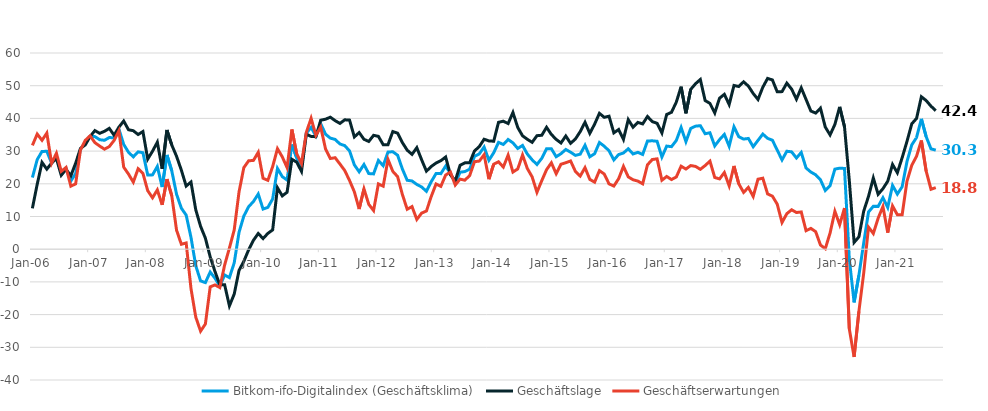
| Category | Bitkom-ifo-Digitalindex (Geschäftsklima) | Geschäftslage | Geschäftserwartungen |
|---|---|---|---|
| 2006-01-01 | 21.91 | 12.49 | 31.75 |
| 2006-02-01 | 27.4 | 19.84 | 35.21 |
| 2006-03-01 | 29.9 | 26.55 | 33.3 |
| 2006-04-01 | 29.93 | 24.48 | 35.52 |
| 2006-05-01 | 26.32 | 26.35 | 26.29 |
| 2006-06-01 | 28.52 | 27.71 | 29.34 |
| 2006-07-01 | 23.21 | 22.61 | 23.81 |
| 2006-08-01 | 24.7 | 24.39 | 25 |
| 2006-09-01 | 20.86 | 22.46 | 19.28 |
| 2006-10-01 | 23.13 | 26.31 | 19.98 |
| 2006-11-01 | 30.57 | 30.81 | 30.34 |
| 2006-12-01 | 32.59 | 31.89 | 33.29 |
| 2007-01-01 | 34.55 | 34.43 | 34.67 |
| 2007-02-01 | 34.43 | 36.28 | 32.6 |
| 2007-03-01 | 33.48 | 35.44 | 31.54 |
| 2007-04-01 | 33.31 | 36.06 | 30.59 |
| 2007-05-01 | 34.15 | 36.95 | 31.38 |
| 2007-06-01 | 34.06 | 34.85 | 33.27 |
| 2007-07-01 | 36.75 | 37.32 | 36.18 |
| 2007-08-01 | 32.04 | 39.2 | 25.1 |
| 2007-09-01 | 29.65 | 36.53 | 22.97 |
| 2007-10-01 | 28.24 | 36.23 | 20.51 |
| 2007-11-01 | 29.78 | 35.07 | 24.61 |
| 2007-12-01 | 29.5 | 35.98 | 23.19 |
| 2008-01-01 | 22.67 | 27.56 | 17.89 |
| 2008-02-01 | 22.73 | 29.98 | 15.72 |
| 2008-03-01 | 25.32 | 32.73 | 18.14 |
| 2008-04-01 | 19 | 24.59 | 13.55 |
| 2008-05-01 | 28.82 | 36.44 | 21.44 |
| 2008-06-01 | 23.99 | 31.88 | 16.36 |
| 2008-07-01 | 16.82 | 28.41 | 5.81 |
| 2008-08-01 | 12.53 | 24.16 | 1.51 |
| 2008-09-01 | 10.43 | 19.31 | 1.91 |
| 2008-10-01 | 3.62 | 20.54 | -12.01 |
| 2008-11-01 | -5.07 | 12.03 | -20.78 |
| 2008-12-01 | -9.7 | 7 | -25.06 |
| 2009-01-01 | -10.21 | 3.37 | -22.87 |
| 2009-02-01 | -6.99 | -2.35 | -11.52 |
| 2009-03-01 | -8.88 | -6.83 | -10.92 |
| 2009-04-01 | -11.31 | -10.88 | -11.73 |
| 2009-05-01 | -7.89 | -10.85 | -4.87 |
| 2009-06-01 | -8.69 | -17.33 | 0.36 |
| 2009-07-01 | -4.16 | -13.72 | 5.9 |
| 2009-08-01 | 5.16 | -6.49 | 17.52 |
| 2009-09-01 | 10.14 | -3.7 | 24.95 |
| 2009-10-01 | 12.99 | -0.18 | 27.03 |
| 2009-11-01 | 14.59 | 2.72 | 27.16 |
| 2009-12-01 | 16.87 | 4.81 | 29.63 |
| 2010-01-01 | 12.27 | 3.25 | 21.69 |
| 2010-02-01 | 12.79 | 4.83 | 21.06 |
| 2010-03-01 | 15.37 | 5.91 | 25.27 |
| 2010-04-01 | 24.69 | 18.79 | 30.74 |
| 2010-05-01 | 22.19 | 16.3 | 28.24 |
| 2010-06-01 | 21.15 | 17.42 | 24.95 |
| 2010-07-01 | 32.01 | 27.49 | 36.61 |
| 2010-08-01 | 27.91 | 26.62 | 29.2 |
| 2010-09-01 | 24.98 | 23.8 | 26.17 |
| 2010-10-01 | 35.43 | 35.18 | 35.69 |
| 2010-11-01 | 37.25 | 34.49 | 40.04 |
| 2010-12-01 | 34.6 | 34.4 | 34.8 |
| 2011-01-01 | 38.39 | 39.45 | 37.34 |
| 2011-02-01 | 35.17 | 39.75 | 30.68 |
| 2011-03-01 | 33.97 | 40.37 | 27.73 |
| 2011-04-01 | 33.57 | 39.31 | 27.98 |
| 2011-05-01 | 32.18 | 38.47 | 26.05 |
| 2011-06-01 | 31.68 | 39.57 | 24.06 |
| 2011-07-01 | 30.05 | 39.48 | 21 |
| 2011-08-01 | 25.79 | 34.34 | 17.55 |
| 2011-09-01 | 23.67 | 35.66 | 12.28 |
| 2011-10-01 | 25.9 | 33.61 | 18.44 |
| 2011-11-01 | 23.13 | 32.95 | 13.72 |
| 2011-12-01 | 23.03 | 34.82 | 11.83 |
| 2012-01-01 | 27.13 | 34.52 | 19.97 |
| 2012-02-01 | 25.53 | 31.97 | 19.27 |
| 2012-03-01 | 29.7 | 31.97 | 27.45 |
| 2012-04-01 | 29.81 | 35.97 | 23.8 |
| 2012-05-01 | 28.74 | 35.48 | 22.19 |
| 2012-06-01 | 24.5 | 32.59 | 16.69 |
| 2012-07-01 | 21.07 | 30.28 | 12.22 |
| 2012-08-01 | 20.87 | 29 | 13.03 |
| 2012-09-01 | 19.8 | 31.05 | 9.1 |
| 2012-10-01 | 19.03 | 27.34 | 11.03 |
| 2012-11-01 | 17.7 | 23.87 | 11.69 |
| 2012-12-01 | 20.65 | 25.29 | 16.11 |
| 2013-01-01 | 23.13 | 26.35 | 19.95 |
| 2013-02-01 | 23.11 | 27.07 | 19.23 |
| 2013-03-01 | 25.42 | 28.19 | 22.68 |
| 2013-04-01 | 23.16 | 22.73 | 23.59 |
| 2013-05-01 | 20.26 | 20.9 | 19.62 |
| 2013-06-01 | 23.54 | 25.66 | 21.43 |
| 2013-07-01 | 23.74 | 26.41 | 21.1 |
| 2013-08-01 | 24.48 | 26.45 | 22.53 |
| 2013-09-01 | 28.4 | 30.05 | 26.76 |
| 2013-10-01 | 29.15 | 31.38 | 26.95 |
| 2013-11-01 | 31.25 | 33.63 | 28.9 |
| 2013-12-01 | 27.19 | 33.12 | 21.41 |
| 2014-01-01 | 29.49 | 33.02 | 26.01 |
| 2014-02-01 | 32.68 | 38.8 | 26.73 |
| 2014-03-01 | 32.03 | 39.15 | 25.12 |
| 2014-04-01 | 33.55 | 38.42 | 28.77 |
| 2014-05-01 | 32.52 | 41.81 | 23.59 |
| 2014-06-01 | 30.8 | 37.24 | 24.54 |
| 2014-07-01 | 31.73 | 34.68 | 28.82 |
| 2014-08-01 | 29.09 | 33.6 | 24.67 |
| 2014-09-01 | 27.33 | 32.68 | 22.11 |
| 2014-10-01 | 25.9 | 34.72 | 17.4 |
| 2014-11-01 | 27.79 | 34.84 | 20.96 |
| 2014-12-01 | 30.71 | 37.28 | 24.32 |
| 2015-01-01 | 30.71 | 35.09 | 26.42 |
| 2015-02-01 | 28.28 | 33.59 | 23.09 |
| 2015-03-01 | 29.21 | 32.49 | 25.98 |
| 2015-04-01 | 30.5 | 34.62 | 26.45 |
| 2015-05-01 | 29.66 | 32.38 | 26.98 |
| 2015-06-01 | 28.69 | 33.7 | 23.79 |
| 2015-07-01 | 29.06 | 35.95 | 22.36 |
| 2015-08-01 | 31.78 | 38.82 | 24.94 |
| 2015-09-01 | 28.27 | 35.42 | 21.34 |
| 2015-10-01 | 29.2 | 38.25 | 20.5 |
| 2015-11-01 | 32.62 | 41.55 | 24.03 |
| 2015-12-01 | 31.5 | 40.33 | 22.99 |
| 2016-01-01 | 30.09 | 40.67 | 19.98 |
| 2016-02-01 | 27.3 | 35.58 | 19.31 |
| 2016-03-01 | 28.95 | 36.6 | 21.55 |
| 2016-04-01 | 29.42 | 33.58 | 25.33 |
| 2016-05-01 | 30.71 | 39.63 | 22.12 |
| 2016-06-01 | 29.12 | 37.29 | 21.23 |
| 2016-07-01 | 29.63 | 38.78 | 20.83 |
| 2016-08-01 | 28.97 | 38.31 | 20 |
| 2016-09-01 | 33.08 | 40.58 | 25.81 |
| 2016-10-01 | 33.15 | 39.02 | 27.42 |
| 2016-11-01 | 33 | 38.5 | 27.63 |
| 2016-12-01 | 28.2 | 35.53 | 21.09 |
| 2017-01-01 | 31.53 | 41.2 | 22.24 |
| 2017-02-01 | 31.36 | 41.87 | 21.3 |
| 2017-03-01 | 33.25 | 44.98 | 22.09 |
| 2017-04-01 | 37.22 | 49.7 | 25.38 |
| 2017-05-01 | 32.89 | 41.56 | 24.52 |
| 2017-06-01 | 36.94 | 48.88 | 25.58 |
| 2017-07-01 | 37.63 | 50.6 | 25.32 |
| 2017-08-01 | 37.77 | 51.9 | 24.43 |
| 2017-09-01 | 35.31 | 45.46 | 25.58 |
| 2017-10-01 | 35.6 | 44.59 | 26.93 |
| 2017-11-01 | 31.58 | 41.65 | 21.93 |
| 2017-12-01 | 33.52 | 46.19 | 21.5 |
| 2018-01-01 | 35.1 | 47.36 | 23.44 |
| 2018-02-01 | 31.48 | 44.24 | 19.38 |
| 2018-03-01 | 37.44 | 50.07 | 25.45 |
| 2018-04-01 | 34.4 | 49.75 | 19.99 |
| 2018-05-01 | 33.68 | 51.19 | 17.39 |
| 2018-06-01 | 33.87 | 49.88 | 18.88 |
| 2018-07-01 | 31.34 | 47.62 | 16.13 |
| 2018-08-01 | 33.28 | 45.79 | 21.41 |
| 2018-09-01 | 35.21 | 49.53 | 21.71 |
| 2018-10-01 | 33.9 | 52.23 | 16.9 |
| 2018-11-01 | 33.32 | 51.76 | 16.22 |
| 2018-12-01 | 30.32 | 48.14 | 13.78 |
| 2019-01-01 | 27.3 | 48.19 | 8.16 |
| 2019-02-01 | 29.96 | 50.78 | 10.86 |
| 2019-03-01 | 29.77 | 48.95 | 12.06 |
| 2019-04-01 | 27.89 | 45.88 | 11.22 |
| 2019-05-01 | 29.58 | 49.34 | 11.39 |
| 2019-06-01 | 24.84 | 45.8 | 5.67 |
| 2019-07-01 | 23.59 | 42.26 | 6.36 |
| 2019-08-01 | 22.76 | 41.63 | 5.37 |
| 2019-09-01 | 21.22 | 43.13 | 1.28 |
| 2019-10-01 | 17.96 | 37.36 | 0.15 |
| 2019-11-01 | 19.43 | 34.95 | 4.94 |
| 2019-12-01 | 24.48 | 38.15 | 11.59 |
| 2020-01-01 | 24.79 | 43.52 | 7.5 |
| 2020-02-01 | 24.69 | 37.47 | 12.59 |
| 2020-03-01 | -2.96 | 21.02 | -24.33 |
| 2020-04-01 | -16.26 | 2.07 | -32.94 |
| 2020-05-01 | -7.94 | 3.78 | -18.99 |
| 2020-06-01 | 1.93 | 11.62 | -7.32 |
| 2020-07-01 | 11.4 | 16.16 | 6.75 |
| 2020-08-01 | 13.13 | 21.77 | 4.82 |
| 2020-09-01 | 13.1 | 16.79 | 9.48 |
| 2020-10-01 | 15.77 | 18.51 | 13.07 |
| 2020-11-01 | 12.79 | 20.79 | 5.07 |
| 2020-12-01 | 19.48 | 25.91 | 13.23 |
| 2021-01-01 | 16.85 | 23.37 | 10.52 |
| 2021-02-01 | 19.09 | 27.98 | 10.55 |
| 2021-03-01 | 26.77 | 32.95 | 20.76 |
| 2021-04-01 | 31.89 | 38.34 | 25.62 |
| 2021-05-01 | 34.16 | 40.01 | 28.46 |
| 2021-06-01 | 39.85 | 46.62 | 33.26 |
| 2021-07-01 | 34.4 | 45.46 | 23.84 |
| 2021-08-01 | 30.69 | 43.74 | 18.33 |
| 2021-09-01 | 30.29 | 42.36 | 18.82 |